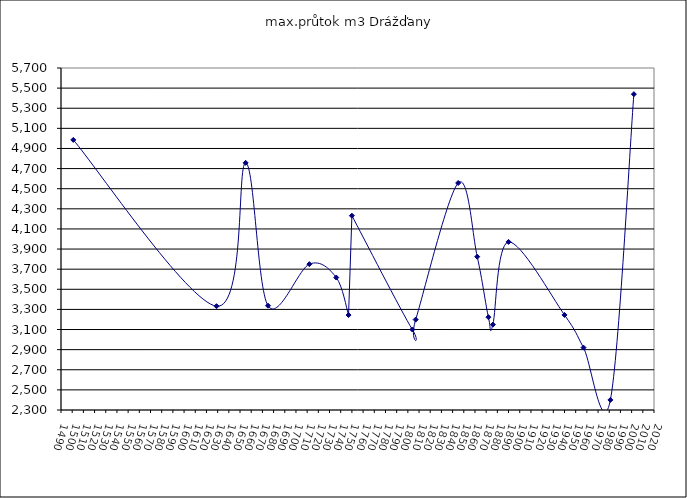
| Category | max.průtok m3 Drážďany |
|---|---|
| 1501.0 | 4985 |
| 1629.0 | 3332 |
| 1655.0 | 4757 |
| 1675.0 | 3337 |
| 1712.0 | 3750 |
| 1736.0 | 3617 |
| 1747.0 | 3244 |
| 1750.0 | 4232 |
| 1804.0 | 3100 |
| 1807.0 | 3199 |
| 1845.0 | 4557 |
| 1862.0 | 3824 |
| 1872.0 | 3223 |
| 1876.0 | 3149 |
| 1890.0 | 3971 |
| 1940.0 | 3245 |
| 1957.0 | 2920 |
| 1981.0 | 2400 |
| 2002.0 | 5440 |